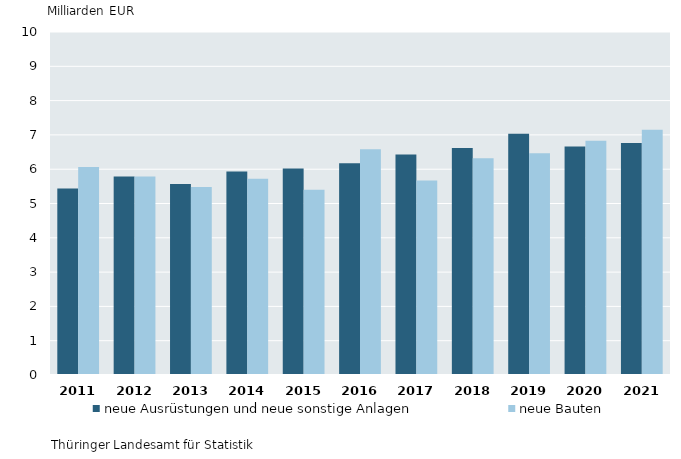
| Category | neue Ausrüstungen und neue sonstige Anlagen | neue Bauten |
|---|---|---|
| 2011.0 | 5.439 | 6.066 |
| 2012.0 | 5.786 | 5.79 |
| 2013.0 | 5.57 | 5.48 |
| 2014.0 | 5.934 | 5.718 |
| 2015.0 | 6.017 | 5.399 |
| 2016.0 | 6.175 | 6.583 |
| 2017.0 | 6.427 | 5.668 |
| 2018.0 | 6.618 | 6.316 |
| 2019.0 | 7.036 | 6.468 |
| 2020.0 | 6.661 | 6.831 |
| 2021.0 | 6.763 | 7.147 |